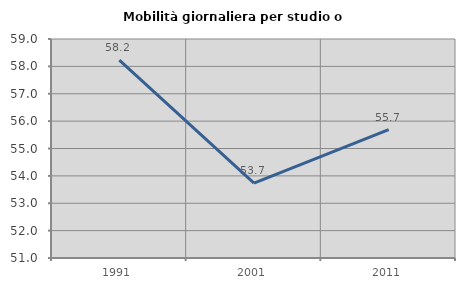
| Category | Mobilità giornaliera per studio o lavoro |
|---|---|
| 1991.0 | 58.229 |
| 2001.0 | 53.738 |
| 2011.0 | 55.689 |